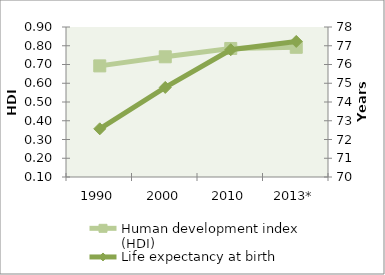
| Category | Human development index (HDI) |
|---|---|
| 1990 | 0.693 |
| 2000 | 0.741 |
| 2010 | 0.785 |
| 2013* | 0.792 |